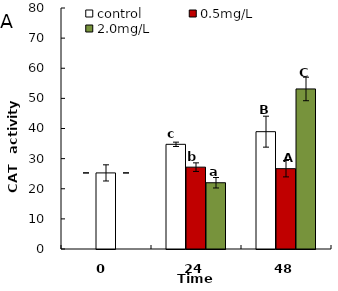
| Category | control | 0.5mg/L | 2.0mg/L |
|---|---|---|---|
| 0.0 | 25.259 | 25.259 | 25.259 |
| 24.0 | 34.749 | 27.169 | 21.993 |
| 48.0 | 38.947 | 26.669 | 53.129 |